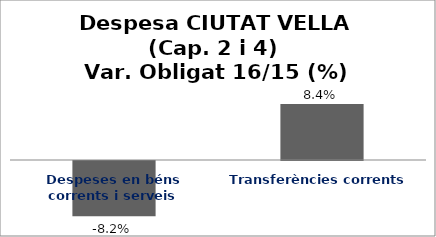
| Category | Series 0 |
|---|---|
| Despeses en béns corrents i serveis | -0.082 |
| Transferències corrents | 0.084 |